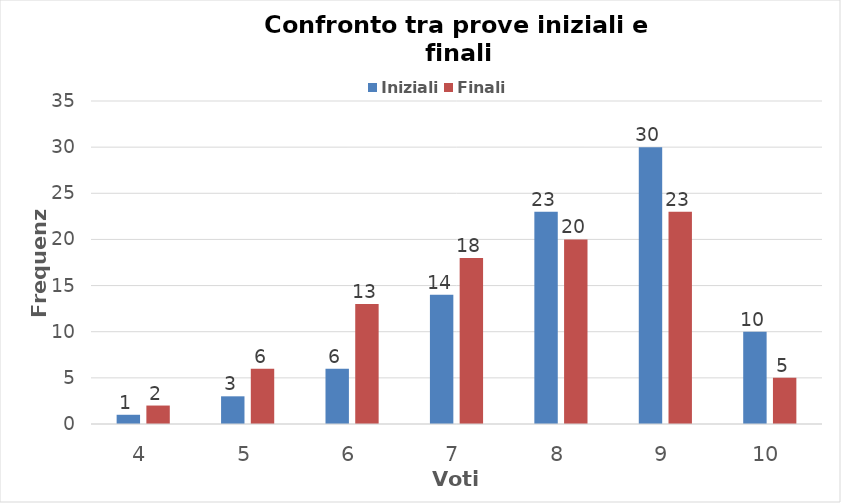
| Category | Iniziali | Finali |
|---|---|---|
| 4.0 | 1 | 2 |
| 5.0 | 3 | 6 |
| 6.0 | 6 | 13 |
| 7.0 | 14 | 18 |
| 8.0 | 23 | 20 |
| 9.0 | 30 | 23 |
| 10.0 | 10 | 5 |